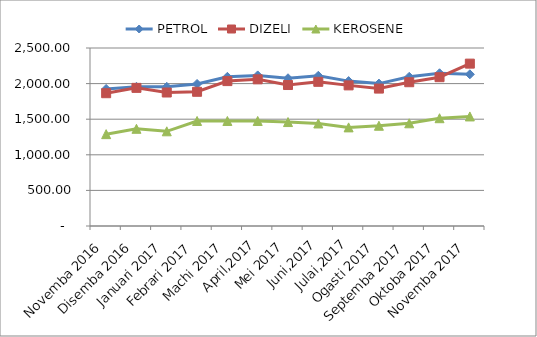
| Category | PETROL | DIZELI | KEROSENE |
|---|---|---|---|
| Novemba 2016 | 1925 | 1865 | 1290 |
| Disemba 2016 | 1955 | 1940 | 1365 |
| Januari 2017 | 1955 | 1875 | 1330 |
| Febrari 2017 | 1995 | 1885 | 1475 |
| Machi 2017 | 2095 | 2035 | 1475 |
| April,2017 | 2115 | 2060 | 1475 |
| Mei 2017 | 2075 | 1980 | 1460 |
| Juni,2017 | 2110 | 2025 | 1440 |
| Julai,2017 | 2035 | 1975 | 1385 |
| Ogasti 2017 | 2000 | 1930 | 1408 |
| Septemba 2017 | 2095.41 | 2019.35 | 1442.65 |
| Oktoba 2017 | 2145 | 2090 | 1514 |
| Novemba 2017 | 2130.445 | 2280.356 | 1538.626 |